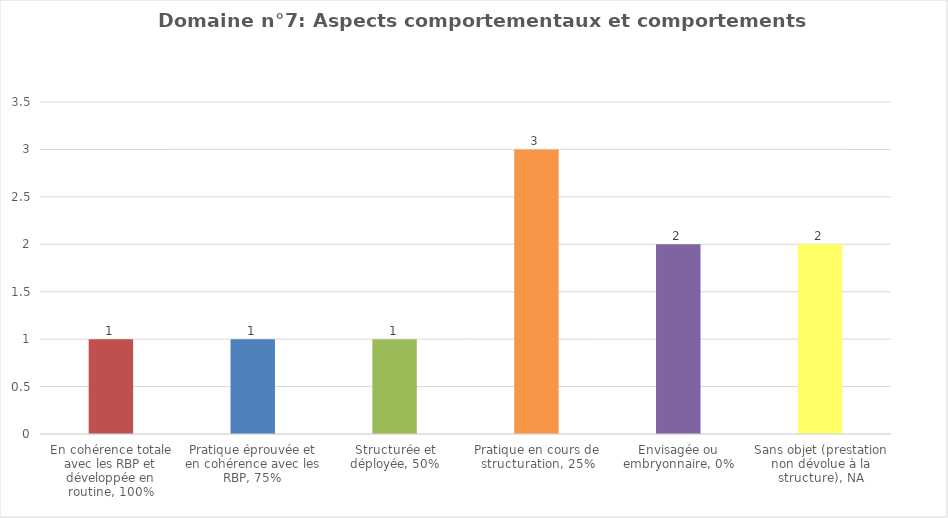
| Category | Domaine n°7: Aspects comportementaux et comportements problèmes |
|---|---|
| En cohérence totale avec les RBP et développée en routine, 100% | 1 |
| Pratique éprouvée et en cohérence avec les RBP, 75% | 1 |
| Structurée et déployée, 50% | 1 |
| Pratique en cours de structuration, 25% | 3 |
| Envisagée ou embryonnaire, 0% | 2 |
| Sans objet (prestation non dévolue à la structure), NA | 2 |